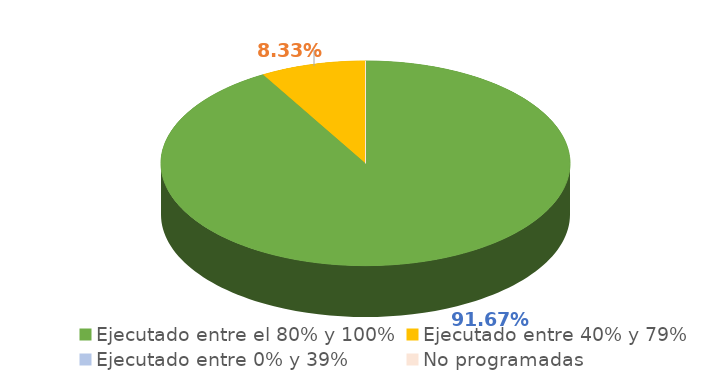
| Category | Series 0 |
|---|---|
| Ejecutado entre el 80% y 100% | 0.917 |
| Ejecutado entre 40% y 79% | 0.083 |
| Ejecutado entre 0% y 39% | 0 |
| No programadas | 0 |